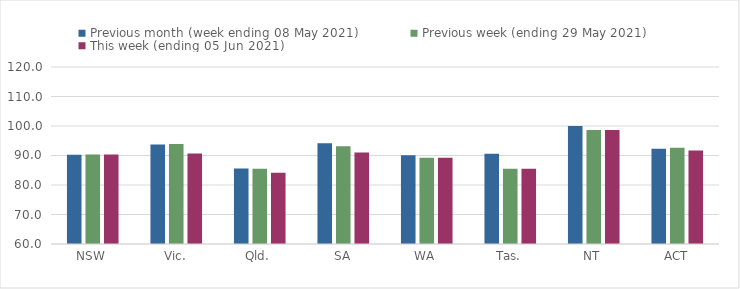
| Category | Previous month (week ending 08 May 2021) | Previous week (ending 29 May 2021) | This week (ending 05 Jun 2021) |
|---|---|---|---|
| NSW | 90.27 | 90.32 | 90.32 |
| Vic. | 93.72 | 93.9 | 90.65 |
| Qld. | 85.57 | 85.52 | 84.18 |
| SA | 94.14 | 93.15 | 91.05 |
| WA | 90.1 | 89.24 | 89.24 |
| Tas. | 90.56 | 85.5 | 85.52 |
| NT | 100 | 98.68 | 98.68 |
| ACT | 92.28 | 92.6 | 91.69 |